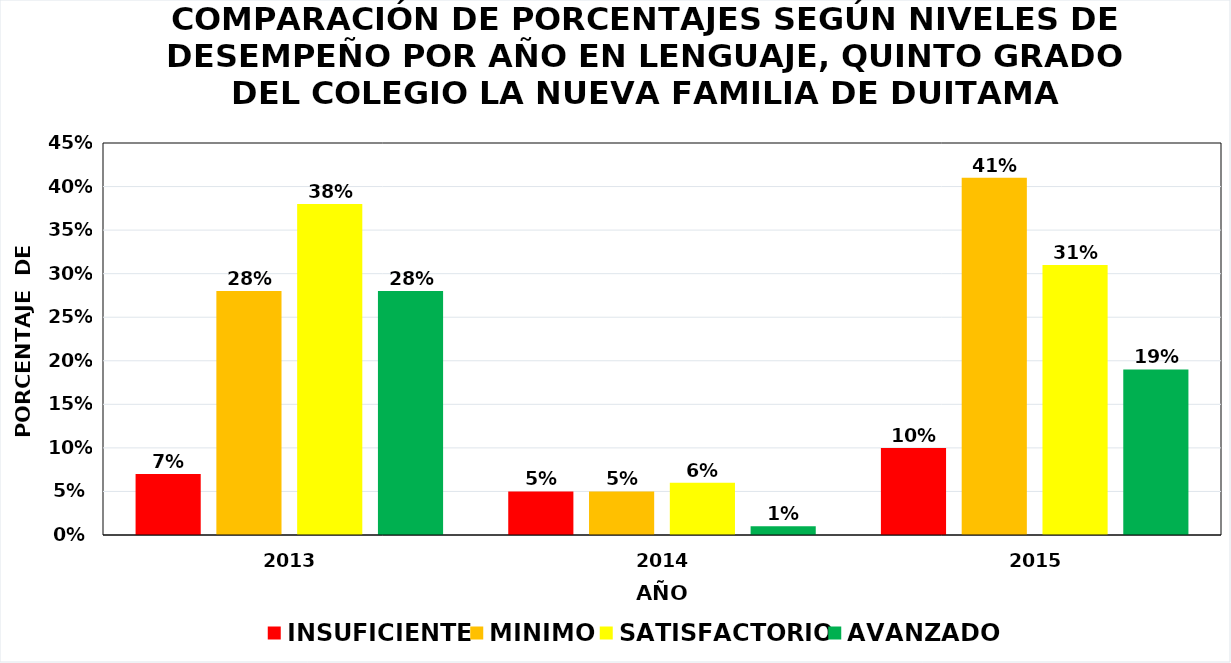
| Category | INSUFICIENTE | MINIMO | SATISFACTORIO | AVANZADO |
|---|---|---|---|---|
| 2013.0 | 0.07 | 0.28 | 0.38 | 0.28 |
| 2014.0 | 0.05 | 0.05 | 0.06 | 0.01 |
| 2015.0 | 0.1 | 0.41 | 0.31 | 0.19 |